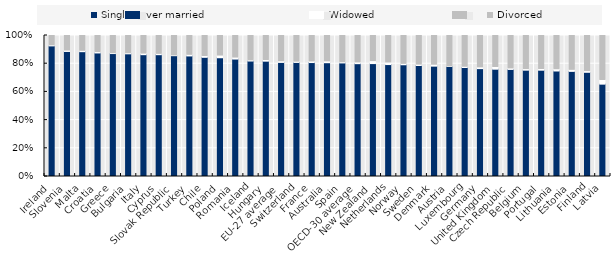
| Category | Single never married | Widowed | Divorced |
|---|---|---|---|
| Ireland | 92.637 | 0.744 | 6.62 |
| Slovenia | 88.684 | 1.012 | 10.304 |
| Malta | 88.523 | 0.975 | 10.502 |
| Croatia | 87.625 | 0.987 | 11.389 |
| Greece | 87.191 | 0.605 | 12.205 |
| Bulgaria | 87.007 | 0.76 | 12.233 |
| Italy | 86.396 | 1.12 | 12.484 |
| Cyprus | 86.395 | 0.913 | 12.692 |
| Slovak Republic | 85.68 | 0.539 | 13.781 |
| Turkey | 85.509 | 1.132 | 13.359 |
| Chile | 84.521 | 1.276 | 14.203 |
| Poland | 84.218 | 1.893 | 13.889 |
| Romania | 83.28 | 1.409 | 15.311 |
| Iceland | 81.902 | 0.813 | 17.285 |
| Hungary | 81.795 | 1.167 | 17.038 |
| EU-27 average | 80.908 | 1.171 | 17.921 |
| Switzerland | 80.894 | 0.898 | 18.208 |
| France | 80.818 | 1.147 | 18.035 |
| Australia | 80.693 | 1.325 | 17.981 |
| Spain | 80.541 | 0.84 | 18.62 |
| OECD-30 average | 80.018 | 1.234 | 18.745 |
| New Zealand | 80 | 2.1 | 17.8 |
| Netherlands | 79.39 | 1.804 | 18.806 |
| Norway | 79.249 | 0.977 | 19.774 |
| Sweden | 78.734 | 0.954 | 20.312 |
| Denmark | 78.269 | 1.364 | 20.368 |
| Austria | 78.014 | 0.381 | 21.605 |
| Luxembourg | 77.298 | 0.863 | 21.839 |
| Germany | 76.504 | 1.245 | 22.251 |
| United Kingdom | 76.1 | 1.9 | 22 |
| Czech Republic | 75.934 | 1.062 | 23.004 |
| Belgium | 75.41 | 1.116 | 23.474 |
| Portugal | 75.395 | 1.183 | 23.422 |
| Lithuania | 74.826 | 1.587 | 23.587 |
| Estonia | 74.546 | 1.442 | 24.012 |
| Finland | 73.902 | 1.214 | 24.884 |
| Latvia | 65.496 | 3.305 | 31.199 |